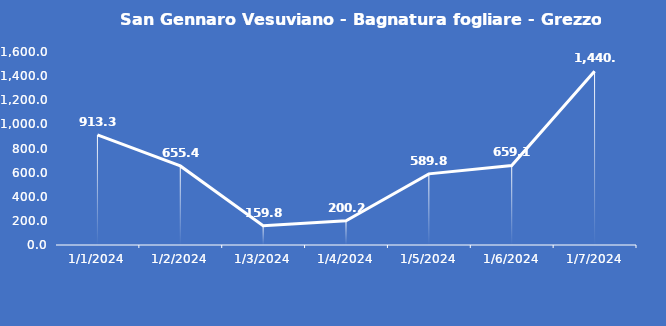
| Category | San Gennaro Vesuviano - Bagnatura fogliare - Grezzo (min) |
|---|---|
| 1/1/24 | 913.3 |
| 1/2/24 | 655.4 |
| 1/3/24 | 159.8 |
| 1/4/24 | 200.2 |
| 1/5/24 | 589.8 |
| 1/6/24 | 659.1 |
| 1/7/24 | 1440 |